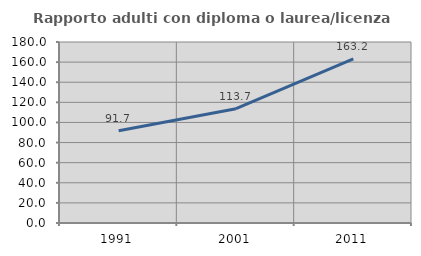
| Category | Rapporto adulti con diploma o laurea/licenza media  |
|---|---|
| 1991.0 | 91.746 |
| 2001.0 | 113.705 |
| 2011.0 | 163.169 |